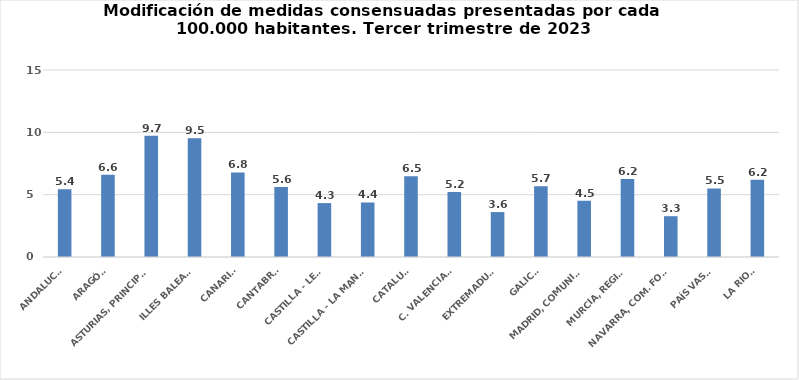
| Category | Series 0 |
|---|---|
| ANDALUCÍA | 5.432 |
| ARAGÓN | 6.596 |
| ASTURIAS, PRINCIPADO | 9.736 |
| ILLES BALEARS | 9.53 |
| CANARIAS | 6.778 |
| CANTABRIA | 5.607 |
| CASTILLA - LEÓN | 4.323 |
| CASTILLA - LA MANCHA | 4.374 |
| CATALUÑA | 6.482 |
| C. VALENCIANA | 5.212 |
| EXTREMADURA | 3.604 |
| GALICIA | 5.667 |
| MADRID, COMUNIDAD | 4.512 |
| MURCIA, REGIÓN | 6.247 |
| NAVARRA, COM. FORAL | 3.273 |
| PAÍS VASCO | 5.496 |
| LA RIOJA | 6.206 |